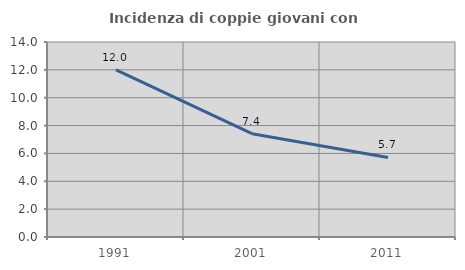
| Category | Incidenza di coppie giovani con figli |
|---|---|
| 1991.0 | 11.995 |
| 2001.0 | 7.419 |
| 2011.0 | 5.71 |